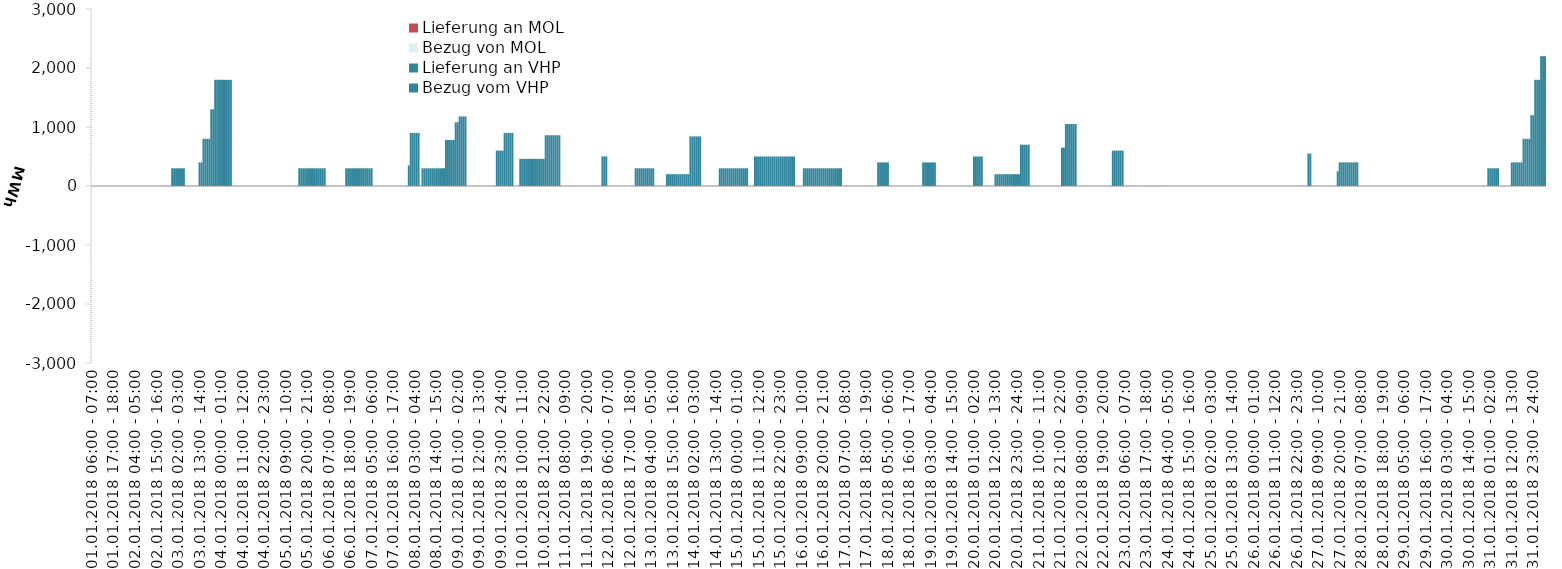
| Category | Bezug vom VHP | Lieferung an VHP | Bezug von MOL | Lieferung an MOL |
|---|---|---|---|---|
| 01.01.2018 06:00 - 07:00 | 0 | 0 | 0 | 0 |
| 01.01.2018 07:00 - 08:00 | 0 | 0 | 0 | 0 |
| 01.01.2018 08:00 - 09:00 | 0 | 0 | 0 | 0 |
| 01.01.2018 09:00 - 10:00 | 0 | 0 | 0 | 0 |
| 01.01.2018 10:00 - 11:00 | 0 | 0 | 0 | 0 |
| 01.01.2018 11:00 - 12:00 | 0 | 0 | 0 | 0 |
| 01.01.2018 12:00 - 13:00 | 0 | 0 | 0 | 0 |
| 01.01.2018 13:00 - 14:00 | 0 | 0 | 0 | 0 |
| 01.01.2018 14:00 - 15:00 | 0 | 0 | 0 | 0 |
| 01.01.2018 15:00 - 16:00 | 0 | 0 | 0 | 0 |
| 01.01.2018 16:00 - 17:00 | 0 | 0 | 0 | 0 |
| 01.01.2018 17:00 - 18:00 | 0 | 0 | 0 | 0 |
| 01.01.2018 18:00 - 19:00 | 0 | 0 | 0 | 0 |
| 01.01.2018 19:00 - 20:00 | 0 | 0 | 0 | 0 |
| 01.01.2018 20:00 - 21:00 | 0 | 0 | 0 | 0 |
| 01.01.2018 21:00 - 22:00 | 0 | 0 | 0 | 0 |
| 01.01.2018 22:00 - 23:00 | 0 | 0 | 0 | 0 |
| 01.01.2018 23:00 - 24:00 | 0 | 0 | 0 | 0 |
| 02.01.2018 00:00 - 01:00 | 0 | 0 | 0 | 0 |
| 02.01.2018 01:00 - 02:00 | 0 | 0 | 0 | 0 |
| 02.01.2018 02:00 - 03:00 | 0 | 0 | 0 | 0 |
| 02.01.2018 03:00 - 04:00 | 0 | 0 | 0 | 0 |
| 02.01.2018 04:00 - 05:00 | 0 | 0 | 0 | 0 |
| 02.01.2018 05:00 - 06:00 | 0 | 0 | 0 | 0 |
| 02.01.2018 06:00 - 07:00 | 0 | 0 | 0 | 0 |
| 02.01.2018 07:00 - 08:00 | 0 | 0 | 0 | 0 |
| 02.01.2018 08:00 - 09:00 | 0 | 0 | 0 | 0 |
| 02.01.2018 09:00 - 10:00 | 0 | 0 | 0 | 0 |
| 02.01.2018 10:00 - 11:00 | 0 | 0 | 0 | 0 |
| 02.01.2018 11:00 - 12:00 | 0 | 0 | 0 | 0 |
| 02.01.2018 12:00 - 13:00 | 0 | 0 | 0 | 0 |
| 02.01.2018 13:00 - 14:00 | 0 | 0 | 0 | 0 |
| 02.01.2018 14:00 - 15:00 | 0 | 0 | 0 | 0 |
| 02.01.2018 15:00 - 16:00 | 0 | 0 | 0 | 0 |
| 02.01.2018 16:00 - 17:00 | 0 | 0 | 0 | 0 |
| 02.01.2018 17:00 - 18:00 | 0 | 0 | 0 | 0 |
| 02.01.2018 18:00 - 19:00 | 0 | 0 | 0 | 0 |
| 02.01.2018 19:00 - 20:00 | 0 | 0 | 0 | 0 |
| 02.01.2018 20:00 - 21:00 | 0 | 0 | 0 | 0 |
| 02.01.2018 21:00 - 22:00 | 0 | 0 | 0 | 0 |
| 02.01.2018 22:00 - 23:00 | 0 | 0 | 0 | 0 |
| 02.01.2018 23:00 - 24:00 | 300 | 0 | 0 | 0 |
| 03.01.2018 00:00 - 01:00 | 300 | 0 | 0 | 0 |
| 03.01.2018 01:00 - 02:00 | 300 | 0 | 0 | 0 |
| 03.01.2018 02:00 - 03:00 | 300 | 0 | 0 | 0 |
| 03.01.2018 03:00 - 04:00 | 300 | 0 | 0 | 0 |
| 03.01.2018 04:00 - 05:00 | 300 | 0 | 0 | 0 |
| 03.01.2018 05:00 - 06:00 | 300 | 0 | 0 | 0 |
| 03.01.2018 06:00 - 07:00 | 0 | 0 | 0 | 0 |
| 03.01.2018 07:00 - 08:00 | 0 | 0 | 0 | 0 |
| 03.01.2018 08:00 - 09:00 | 0 | 0 | 0 | 0 |
| 03.01.2018 09:00 - 10:00 | 0 | 0 | 0 | 0 |
| 03.01.2018 10:00 - 11:00 | 0 | 0 | 0 | 0 |
| 03.01.2018 11:00 - 12:00 | 0 | 0 | 0 | 0 |
| 03.01.2018 12:00 - 13:00 | 0 | 0 | 0 | 0 |
| 03.01.2018 13:00 - 14:00 | 400 | 0 | 0 | 0 |
| 03.01.2018 14:00 - 15:00 | 400 | 0 | 0 | 0 |
| 03.01.2018 15:00 - 16:00 | 800 | 0 | 0 | 0 |
| 03.01.2018 16:00 - 17:00 | 800 | 0 | 0 | 0 |
| 03.01.2018 17:00 - 18:00 | 800 | 0 | 0 | 0 |
| 03.01.2018 18:00 - 19:00 | 800 | 0 | 0 | 0 |
| 03.01.2018 19:00 - 20:00 | 1300 | 0 | 0 | 0 |
| 03.01.2018 20:00 - 21:00 | 1300 | 0 | 0 | 0 |
| 03.01.2018 21:00 - 22:00 | 1800 | 0 | 0 | 0 |
| 03.01.2018 22:00 - 23:00 | 1800 | 0 | 0 | 0 |
| 03.01.2018 23:00 - 24:00 | 1800 | 0 | 0 | 0 |
| 04.01.2018 00:00 - 01:00 | 1800 | 0 | 0 | 0 |
| 04.01.2018 01:00 - 02:00 | 1800 | 0 | 0 | 0 |
| 04.01.2018 02:00 - 03:00 | 1800 | 0 | 0 | 0 |
| 04.01.2018 03:00 - 04:00 | 1800 | 0 | 0 | 0 |
| 04.01.2018 04:00 - 05:00 | 1800 | 0 | 0 | 0 |
| 04.01.2018 05:00 - 06:00 | 1800 | 0 | 0 | 0 |
| 04.01.2018 06:00 - 07:00 | 0 | 0 | 0 | 0 |
| 04.01.2018 07:00 - 08:00 | 0 | 0 | 0 | 0 |
| 04.01.2018 08:00 - 09:00 | 0 | 0 | 0 | 0 |
| 04.01.2018 09:00 - 10:00 | 0 | 0 | 0 | 0 |
| 04.01.2018 10:00 - 11:00 | 0 | 0 | 0 | 0 |
| 04.01.2018 11:00 - 12:00 | 0 | 0 | 0 | 0 |
| 04.01.2018 12:00 - 13:00 | 0 | 0 | 0 | 0 |
| 04.01.2018 13:00 - 14:00 | 0 | 0 | 0 | 0 |
| 04.01.2018 14:00 - 15:00 | 0 | 0 | 0 | 0 |
| 04.01.2018 15:00 - 16:00 | 0 | 0 | 0 | 0 |
| 04.01.2018 16:00 - 17:00 | 0 | 0 | 0 | 0 |
| 04.01.2018 17:00 - 18:00 | 0 | 0 | 0 | 0 |
| 04.01.2018 18:00 - 19:00 | 0 | 0 | 0 | 0 |
| 04.01.2018 19:00 - 20:00 | 0 | 0 | 0 | 0 |
| 04.01.2018 20:00 - 21:00 | 0 | 0 | 0 | 0 |
| 04.01.2018 21:00 - 22:00 | 0 | 0 | 0 | 0 |
| 04.01.2018 22:00 - 23:00 | 0 | 0 | 0 | 0 |
| 04.01.2018 23:00 - 24:00 | 0 | 0 | 0 | 0 |
| 05.01.2018 00:00 - 01:00 | 0 | 0 | 0 | 0 |
| 05.01.2018 01:00 - 02:00 | 0 | 0 | 0 | 0 |
| 05.01.2018 02:00 - 03:00 | 0 | 0 | 0 | 0 |
| 05.01.2018 03:00 - 04:00 | 0 | 0 | 0 | 0 |
| 05.01.2018 04:00 - 05:00 | 0 | 0 | 0 | 0 |
| 05.01.2018 05:00 - 06:00 | 0 | 0 | 0 | 0 |
| 05.01.2018 06:00 - 07:00 | 0 | 0 | 0 | 0 |
| 05.01.2018 07:00 - 08:00 | 0 | 0 | 0 | 0 |
| 05.01.2018 08:00 - 09:00 | 0 | 0 | 0 | 0 |
| 05.01.2018 09:00 - 10:00 | 0 | 0 | 0 | 0 |
| 05.01.2018 10:00 - 11:00 | 0 | 0 | 0 | 0 |
| 05.01.2018 11:00 - 12:00 | 0 | 0 | 0 | 0 |
| 05.01.2018 12:00 - 13:00 | 0 | 0 | 0 | 0 |
| 05.01.2018 13:00 - 14:00 | 0 | 0 | 0 | 0 |
| 05.01.2018 14:00 - 15:00 | 0 | 0 | 0 | 0 |
| 05.01.2018 15:00 - 16:00 | 0 | 0 | 0 | 0 |
| 05.01.2018 16:00 - 17:00 | 300 | 0 | 0 | 0 |
| 05.01.2018 17:00 - 18:00 | 300 | 0 | 0 | 0 |
| 05.01.2018 18:00 - 19:00 | 300 | 0 | 0 | 0 |
| 05.01.2018 19:00 - 20:00 | 300 | 0 | 0 | 0 |
| 05.01.2018 20:00 - 21:00 | 300 | 0 | 0 | 0 |
| 05.01.2018 21:00 - 22:00 | 300 | 0 | 0 | 0 |
| 05.01.2018 22:00 - 23:00 | 300 | 0 | 0 | 0 |
| 05.01.2018 23:00 - 24:00 | 300 | 0 | 0 | 0 |
| 06.01.2018 00:00 - 01:00 | 300 | 0 | 0 | 0 |
| 06.01.2018 01:00 - 02:00 | 300 | 0 | 0 | 0 |
| 06.01.2018 02:00 - 03:00 | 300 | 0 | 0 | 0 |
| 06.01.2018 03:00 - 04:00 | 300 | 0 | 0 | 0 |
| 06.01.2018 04:00 - 05:00 | 300 | 0 | 0 | 0 |
| 06.01.2018 05:00 - 06:00 | 300 | 0 | 0 | 0 |
| 06.01.2018 06:00 - 07:00 | 0 | 0 | 0 | 0 |
| 06.01.2018 07:00 - 08:00 | 0 | 0 | 0 | 0 |
| 06.01.2018 08:00 - 09:00 | 0 | 0 | 0 | 0 |
| 06.01.2018 09:00 - 10:00 | 0 | 0 | 0 | 0 |
| 06.01.2018 10:00 - 11:00 | 0 | 0 | 0 | 0 |
| 06.01.2018 11:00 - 12:00 | 0 | 0 | 0 | 0 |
| 06.01.2018 12:00 - 13:00 | 0 | 0 | 0 | 0 |
| 06.01.2018 13:00 - 14:00 | 0 | 0 | 0 | 0 |
| 06.01.2018 14:00 - 15:00 | 0 | 0 | 0 | 0 |
| 06.01.2018 15:00 - 16:00 | 0 | 0 | 0 | 0 |
| 06.01.2018 16:00 - 17:00 | 300 | 0 | 0 | 0 |
| 06.01.2018 17:00 - 18:00 | 300 | 0 | 0 | 0 |
| 06.01.2018 18:00 - 19:00 | 300 | 0 | 0 | 0 |
| 06.01.2018 19:00 - 20:00 | 300 | 0 | 0 | 0 |
| 06.01.2018 20:00 - 21:00 | 300 | 0 | 0 | 0 |
| 06.01.2018 21:00 - 22:00 | 300 | 0 | 0 | 0 |
| 06.01.2018 22:00 - 23:00 | 300 | 0 | 0 | 0 |
| 06.01.2018 23:00 - 24:00 | 300 | 0 | 0 | 0 |
| 07.01.2018 00:00 - 01:00 | 300 | 0 | 0 | 0 |
| 07.01.2018 01:00 - 02:00 | 300 | 0 | 0 | 0 |
| 07.01.2018 02:00 - 03:00 | 300 | 0 | 0 | 0 |
| 07.01.2018 03:00 - 04:00 | 300 | 0 | 0 | 0 |
| 07.01.2018 04:00 - 05:00 | 300 | 0 | 0 | 0 |
| 07.01.2018 05:00 - 06:00 | 300 | 0 | 0 | 0 |
| 07.01.2018 06:00 - 07:00 | 0 | 0 | 0 | 0 |
| 07.01.2018 07:00 - 08:00 | 0 | 0 | 0 | 0 |
| 07.01.2018 08:00 - 09:00 | 0 | 0 | 0 | 0 |
| 07.01.2018 09:00 - 10:00 | 0 | 0 | 0 | 0 |
| 07.01.2018 10:00 - 11:00 | 0 | 0 | 0 | 0 |
| 07.01.2018 11:00 - 12:00 | 0 | 0 | 0 | 0 |
| 07.01.2018 12:00 - 13:00 | 0 | 0 | 0 | 0 |
| 07.01.2018 13:00 - 14:00 | 0 | 0 | 0 | 0 |
| 07.01.2018 14:00 - 15:00 | 0 | 0 | 0 | 0 |
| 07.01.2018 15:00 - 16:00 | 0 | 0 | 0 | 0 |
| 07.01.2018 16:00 - 17:00 | 0 | 0 | 0 | 0 |
| 07.01.2018 17:00 - 18:00 | 0 | 0 | 0 | 0 |
| 07.01.2018 18:00 - 19:00 | 0 | 0 | 0 | 0 |
| 07.01.2018 19:00 - 20:00 | 0 | 0 | 0 | 0 |
| 07.01.2018 20:00 - 21:00 | 0 | 0 | 0 | 0 |
| 07.01.2018 21:00 - 22:00 | 0 | 0 | 0 | 0 |
| 07.01.2018 22:00 - 23:00 | 0 | 0 | 0 | 0 |
| 07.01.2018 23:00 - 24:00 | 0 | 0 | 0 | 0 |
| 08.01.2018 00:00 - 01:00 | 349 | 0 | 0 | 0 |
| 08.01.2018 01:00 - 02:00 | 900 | 0 | 0 | 0 |
| 08.01.2018 02:00 - 03:00 | 900 | 0 | 0 | 0 |
| 08.01.2018 03:00 - 04:00 | 900 | 0 | 0 | 0 |
| 08.01.2018 04:00 - 05:00 | 900 | 0 | 0 | 0 |
| 08.01.2018 05:00 - 06:00 | 900 | 0 | 0 | 0 |
| 08.01.2018 06:00 - 07:00 | 0 | 0 | 0 | 0 |
| 08.01.2018 07:00 - 08:00 | 300 | 0 | 0 | 0 |
| 08.01.2018 08:00 - 09:00 | 300 | 0 | 0 | 0 |
| 08.01.2018 09:00 - 10:00 | 300 | 0 | 0 | 0 |
| 08.01.2018 10:00 - 11:00 | 300 | 0 | 0 | 0 |
| 08.01.2018 11:00 - 12:00 | 300 | 0 | 0 | 0 |
| 08.01.2018 12:00 - 13:00 | 300 | 0 | 0 | 0 |
| 08.01.2018 13:00 - 14:00 | 300 | 0 | 0 | 0 |
| 08.01.2018 14:00 - 15:00 | 300 | 0 | 0 | 0 |
| 08.01.2018 15:00 - 16:00 | 300 | 0 | 0 | 0 |
| 08.01.2018 16:00 - 17:00 | 300 | 0 | 0 | 0 |
| 08.01.2018 17:00 - 18:00 | 300 | 0 | 0 | 0 |
| 08.01.2018 18:00 - 19:00 | 300 | 0 | 0 | 0 |
| 08.01.2018 19:00 - 20:00 | 780 | 0 | 0 | 0 |
| 08.01.2018 20:00 - 21:00 | 780 | 0 | 0 | 0 |
| 08.01.2018 21:00 - 22:00 | 780 | 0 | 0 | 0 |
| 08.01.2018 22:00 - 23:00 | 780 | 0 | 0 | 0 |
| 08.01.2018 23:00 - 24:00 | 780 | 0 | 0 | 0 |
| 09.01.2018 00:00 - 01:00 | 1080 | 0 | 0 | 0 |
| 09.01.2018 01:00 - 02:00 | 1080 | 0 | 0 | 0 |
| 09.01.2018 02:00 - 03:00 | 1180 | 0 | 0 | 0 |
| 09.01.2018 03:00 - 04:00 | 1180 | 0 | 0 | 0 |
| 09.01.2018 04:00 - 05:00 | 1180 | 0 | 0 | 0 |
| 09.01.2018 05:00 - 06:00 | 1180 | 0 | 0 | 0 |
| 09.01.2018 06:00 - 07:00 | 0 | 0 | 0 | 0 |
| 09.01.2018 07:00 - 08:00 | 0 | 0 | 0 | 0 |
| 09.01.2018 08:00 - 09:00 | 0 | 0 | 0 | 0 |
| 09.01.2018 09:00 - 10:00 | 0 | 0 | 0 | 0 |
| 09.01.2018 10:00 - 11:00 | 0 | 0 | 0 | 0 |
| 09.01.2018 11:00 - 12:00 | 0 | 0 | 0 | 0 |
| 09.01.2018 12:00 - 13:00 | 0 | 0 | 0 | 0 |
| 09.01.2018 13:00 - 14:00 | 0 | 0 | 0 | 0 |
| 09.01.2018 14:00 - 15:00 | 0 | 0 | 0 | 0 |
| 09.01.2018 15:00 - 16:00 | 0 | 0 | 0 | 0 |
| 09.01.2018 16:00 - 17:00 | 0 | 0 | 0 | 0 |
| 09.01.2018 17:00 - 18:00 | 0 | 0 | 0 | 0 |
| 09.01.2018 18:00 - 19:00 | 0 | 0 | 0 | 0 |
| 09.01.2018 19:00 - 20:00 | 0 | 0 | 0 | 0 |
| 09.01.2018 20:00 - 21:00 | 0 | 0 | 0 | 0 |
| 09.01.2018 21:00 - 22:00 | 600 | 0 | 0 | 0 |
| 09.01.2018 22:00 - 23:00 | 600 | 0 | 0 | 0 |
| 09.01.2018 23:00 - 24:00 | 600 | 0 | 0 | 0 |
| 10.01.2018 00:00 - 01:00 | 600 | 0 | 0 | 0 |
| 10.01.2018 01:00 - 02:00 | 900 | 0 | 0 | 0 |
| 10.01.2018 02:00 - 03:00 | 900 | 0 | 0 | 0 |
| 10.01.2018 03:00 - 04:00 | 900 | 0 | 0 | 0 |
| 10.01.2018 04:00 - 05:00 | 900 | 0 | 0 | 0 |
| 10.01.2018 05:00 - 06:00 | 900 | 0 | 0 | 0 |
| 10.01.2018 06:00 - 07:00 | 0 | 0 | 0 | 0 |
| 10.01.2018 07:00 - 08:00 | 0 | 0 | 0 | 0 |
| 10.01.2018 08:00 - 09:00 | 0 | 0 | 0 | 0 |
| 10.01.2018 09:00 - 10:00 | 460 | 0 | 0 | 0 |
| 10.01.2018 10:00 - 11:00 | 460 | 0 | 0 | 0 |
| 10.01.2018 11:00 - 12:00 | 460 | 0 | 0 | 0 |
| 10.01.2018 12:00 - 13:00 | 460 | 0 | 0 | 0 |
| 10.01.2018 13:00 - 14:00 | 460 | 0 | 0 | 0 |
| 10.01.2018 14:00 - 15:00 | 460 | 0 | 0 | 0 |
| 10.01.2018 15:00 - 16:00 | 460 | 0 | 0 | 0 |
| 10.01.2018 16:00 - 17:00 | 460 | 0 | 0 | 0 |
| 10.01.2018 17:00 - 18:00 | 460 | 0 | 0 | 0 |
| 10.01.2018 18:00 - 19:00 | 460 | 0 | 0 | 0 |
| 10.01.2018 19:00 - 20:00 | 460 | 0 | 0 | 0 |
| 10.01.2018 20:00 - 21:00 | 460 | 0 | 0 | 0 |
| 10.01.2018 21:00 - 22:00 | 460 | 0 | 0 | 0 |
| 10.01.2018 22:00 - 23:00 | 860 | 0 | 0 | 0 |
| 10.01.2018 23:00 - 24:00 | 860 | 0 | 0 | 0 |
| 11.01.2018 00:00 - 01:00 | 860 | 0 | 0 | 0 |
| 11.01.2018 01:00 - 02:00 | 860 | 0 | 0 | 0 |
| 11.01.2018 02:00 - 03:00 | 860 | 0 | 0 | 0 |
| 11.01.2018 03:00 - 04:00 | 860 | 0 | 0 | 0 |
| 11.01.2018 04:00 - 05:00 | 860 | 0 | 0 | 0 |
| 11.01.2018 05:00 - 06:00 | 860 | 0 | 0 | 0 |
| 11.01.2018 06:00 - 07:00 | 0 | 0 | 0 | 0 |
| 11.01.2018 07:00 - 08:00 | 0 | 0 | 0 | 0 |
| 11.01.2018 08:00 - 09:00 | 0 | 0 | 0 | 0 |
| 11.01.2018 09:00 - 10:00 | 0 | 0 | 0 | 0 |
| 11.01.2018 10:00 - 11:00 | 0 | 0 | 0 | 0 |
| 11.01.2018 11:00 - 12:00 | 0 | 0 | 0 | 0 |
| 11.01.2018 12:00 - 13:00 | 0 | 0 | 0 | 0 |
| 11.01.2018 13:00 - 14:00 | 0 | 0 | 0 | 0 |
| 11.01.2018 14:00 - 15:00 | 0 | 0 | 0 | 0 |
| 11.01.2018 15:00 - 16:00 | 0 | 0 | 0 | 0 |
| 11.01.2018 16:00 - 17:00 | 0 | 0 | 0 | 0 |
| 11.01.2018 17:00 - 18:00 | 0 | 0 | 0 | 0 |
| 11.01.2018 18:00 - 19:00 | 0 | 0 | 0 | 0 |
| 11.01.2018 19:00 - 20:00 | 0 | 0 | 0 | 0 |
| 11.01.2018 20:00 - 21:00 | 0 | 0 | 0 | 0 |
| 11.01.2018 21:00 - 22:00 | 0 | 0 | 0 | 0 |
| 11.01.2018 22:00 - 23:00 | 0 | 0 | 0 | 0 |
| 11.01.2018 23:00 - 24:00 | 0 | 0 | 0 | 0 |
| 12.01.2018 00:00 - 01:00 | 0 | 0 | 0 | 0 |
| 12.01.2018 01:00 - 02:00 | 0 | 0 | 0 | 0 |
| 12.01.2018 02:00 - 03:00 | 0 | 0 | 0 | 0 |
| 12.01.2018 03:00 - 04:00 | 501 | 0 | 0 | 0 |
| 12.01.2018 04:00 - 05:00 | 501 | 0 | 0 | 0 |
| 12.01.2018 05:00 - 06:00 | 501 | 0 | 0 | 0 |
| 12.01.2018 06:00 - 07:00 | 0 | 0 | 0 | 0 |
| 12.01.2018 07:00 - 08:00 | 0 | 0 | 0 | 0 |
| 12.01.2018 08:00 - 09:00 | 0 | 0 | 0 | 0 |
| 12.01.2018 09:00 - 10:00 | 0 | 0 | 0 | 0 |
| 12.01.2018 10:00 - 11:00 | 0 | 0 | 0 | 0 |
| 12.01.2018 11:00 - 12:00 | 0 | 0 | 0 | 0 |
| 12.01.2018 12:00 - 13:00 | 0 | 0 | 0 | 0 |
| 12.01.2018 13:00 - 14:00 | 0 | 0 | 0 | 0 |
| 12.01.2018 14:00 - 15:00 | 0 | 0 | 0 | 0 |
| 12.01.2018 15:00 - 16:00 | 0 | 0 | 0 | 0 |
| 12.01.2018 16:00 - 17:00 | 0 | 0 | 0 | 0 |
| 12.01.2018 17:00 - 18:00 | 0 | 0 | 0 | 0 |
| 12.01.2018 18:00 - 19:00 | 0 | 0 | 0 | 0 |
| 12.01.2018 19:00 - 20:00 | 0 | 0 | 0 | 0 |
| 12.01.2018 20:00 - 21:00 | 300 | 0 | 0 | 0 |
| 12.01.2018 21:00 - 22:00 | 300 | 0 | 0 | 0 |
| 12.01.2018 22:00 - 23:00 | 300 | 0 | 0 | 0 |
| 12.01.2018 23:00 - 24:00 | 300 | 0 | 0 | 0 |
| 13.01.2018 00:00 - 01:00 | 300 | 0 | 0 | 0 |
| 13.01.2018 01:00 - 02:00 | 300 | 0 | 0 | 0 |
| 13.01.2018 02:00 - 03:00 | 300 | 0 | 0 | 0 |
| 13.01.2018 03:00 - 04:00 | 300 | 0 | 0 | 0 |
| 13.01.2018 04:00 - 05:00 | 300 | 0 | 0 | 0 |
| 13.01.2018 05:00 - 06:00 | 300 | 0 | 0 | 0 |
| 13.01.2018 06:00 - 07:00 | 0 | 0 | 0 | 0 |
| 13.01.2018 07:00 - 08:00 | 0 | 0 | 0 | 0 |
| 13.01.2018 08:00 - 09:00 | 0 | 0 | 0 | 0 |
| 13.01.2018 09:00 - 10:00 | 0 | 0 | 0 | 0 |
| 13.01.2018 10:00 - 11:00 | 0 | 0 | 0 | 0 |
| 13.01.2018 11:00 - 12:00 | 0 | 0 | 0 | 0 |
| 13.01.2018 12:00 - 13:00 | 200 | 0 | 0 | 0 |
| 13.01.2018 13:00 - 14:00 | 200 | 0 | 0 | 0 |
| 13.01.2018 14:00 - 15:00 | 200 | 0 | 0 | 0 |
| 13.01.2018 15:00 - 16:00 | 200 | 0 | 0 | 0 |
| 13.01.2018 16:00 - 17:00 | 200 | 0 | 0 | 0 |
| 13.01.2018 17:00 - 18:00 | 200 | 0 | 0 | 0 |
| 13.01.2018 18:00 - 19:00 | 200 | 0 | 0 | 0 |
| 13.01.2018 19:00 - 20:00 | 200 | 0 | 0 | 0 |
| 13.01.2018 20:00 - 21:00 | 200 | 0 | 0 | 0 |
| 13.01.2018 21:00 - 22:00 | 200 | 0 | 0 | 0 |
| 13.01.2018 22:00 - 23:00 | 200 | 0 | 0 | 0 |
| 13.01.2018 23:00 - 24:00 | 200 | 0 | 0 | 0 |
| 14.01.2018 00:00 - 01:00 | 840 | 0 | 0 | 0 |
| 14.01.2018 01:00 - 02:00 | 840 | 0 | 0 | 0 |
| 14.01.2018 02:00 - 03:00 | 840 | 0 | 0 | 0 |
| 14.01.2018 03:00 - 04:00 | 840 | 0 | 0 | 0 |
| 14.01.2018 04:00 - 05:00 | 840 | 0 | 0 | 0 |
| 14.01.2018 05:00 - 06:00 | 840 | 0 | 0 | 0 |
| 14.01.2018 06:00 - 07:00 | 0 | 0 | 0 | 0 |
| 14.01.2018 07:00 - 08:00 | 0 | 0 | 0 | 0 |
| 14.01.2018 08:00 - 09:00 | 0 | 0 | 0 | 0 |
| 14.01.2018 09:00 - 10:00 | 0 | 0 | 0 | 0 |
| 14.01.2018 10:00 - 11:00 | 0 | 0 | 0 | 0 |
| 14.01.2018 11:00 - 12:00 | 0 | 0 | 0 | 0 |
| 14.01.2018 12:00 - 13:00 | 0 | 0 | 0 | 0 |
| 14.01.2018 13:00 - 14:00 | 0 | 0 | 0 | 0 |
| 14.01.2018 14:00 - 15:00 | 0 | 0 | 0 | 0 |
| 14.01.2018 15:00 - 16:00 | 300 | 0 | 0 | 0 |
| 14.01.2018 16:00 - 17:00 | 300 | 0 | 0 | 0 |
| 14.01.2018 17:00 - 18:00 | 300 | 0 | 0 | 0 |
| 14.01.2018 18:00 - 19:00 | 300 | 0 | 0 | 0 |
| 14.01.2018 19:00 - 20:00 | 300 | 0 | 0 | 0 |
| 14.01.2018 20:00 - 21:00 | 300 | 0 | 0 | 0 |
| 14.01.2018 21:00 - 22:00 | 300 | 0 | 0 | 0 |
| 14.01.2018 22:00 - 23:00 | 300 | 0 | 0 | 0 |
| 14.01.2018 23:00 - 24:00 | 300 | 0 | 0 | 0 |
| 15.01.2018 00:00 - 01:00 | 300 | 0 | 0 | 0 |
| 15.01.2018 01:00 - 02:00 | 300 | 0 | 0 | 0 |
| 15.01.2018 02:00 - 03:00 | 300 | 0 | 0 | 0 |
| 15.01.2018 03:00 - 04:00 | 300 | 0 | 0 | 0 |
| 15.01.2018 04:00 - 05:00 | 300 | 0 | 0 | 0 |
| 15.01.2018 05:00 - 06:00 | 300 | 0 | 0 | 0 |
| 15.01.2018 06:00 - 07:00 | 0 | 0 | 0 | 0 |
| 15.01.2018 07:00 - 08:00 | 0 | 0 | 0 | 0 |
| 15.01.2018 08:00 - 09:00 | 0 | 0 | 0 | 0 |
| 15.01.2018 09:00 - 10:00 | 500 | 0 | 0 | 0 |
| 15.01.2018 10:00 - 11:00 | 500 | 0 | 0 | 0 |
| 15.01.2018 11:00 - 12:00 | 500 | 0 | 0 | 0 |
| 15.01.2018 12:00 - 13:00 | 500 | 0 | 0 | 0 |
| 15.01.2018 13:00 - 14:00 | 500 | 0 | 0 | 0 |
| 15.01.2018 14:00 - 15:00 | 500 | 0 | 0 | 0 |
| 15.01.2018 15:00 - 16:00 | 500 | 0 | 0 | 0 |
| 15.01.2018 16:00 - 17:00 | 500 | 0 | 0 | 0 |
| 15.01.2018 17:00 - 18:00 | 500 | 0 | 0 | 0 |
| 15.01.2018 18:00 - 19:00 | 500 | 0 | 0 | 0 |
| 15.01.2018 19:00 - 20:00 | 500 | 0 | 0 | 0 |
| 15.01.2018 20:00 - 21:00 | 500 | 0 | 0 | 0 |
| 15.01.2018 21:00 - 22:00 | 500 | 0 | 0 | 0 |
| 15.01.2018 22:00 - 23:00 | 500 | 0 | 0 | 0 |
| 15.01.2018 23:00 - 24:00 | 500 | 0 | 0 | 0 |
| 16.01.2018 00:00 - 01:00 | 500 | 0 | 0 | 0 |
| 16.01.2018 01:00 - 02:00 | 500 | 0 | 0 | 0 |
| 16.01.2018 02:00 - 03:00 | 500 | 0 | 0 | 0 |
| 16.01.2018 03:00 - 04:00 | 500 | 0 | 0 | 0 |
| 16.01.2018 04:00 - 05:00 | 500 | 0 | 0 | 0 |
| 16.01.2018 05:00 - 06:00 | 500 | 0 | 0 | 0 |
| 16.01.2018 06:00 - 07:00 | 0 | 0 | 0 | 0 |
| 16.01.2018 07:00 - 08:00 | 0 | 0 | 0 | 0 |
| 16.01.2018 08:00 - 09:00 | 0 | 0 | 0 | 0 |
| 16.01.2018 09:00 - 10:00 | 0 | 0 | 0 | 0 |
| 16.01.2018 10:00 - 11:00 | 300 | 0 | 0 | 0 |
| 16.01.2018 11:00 - 12:00 | 300 | 0 | 0 | 0 |
| 16.01.2018 12:00 - 13:00 | 300 | 0 | 0 | 0 |
| 16.01.2018 13:00 - 14:00 | 300 | 0 | 0 | 0 |
| 16.01.2018 14:00 - 15:00 | 300 | 0 | 0 | 0 |
| 16.01.2018 15:00 - 16:00 | 300 | 0 | 0 | 0 |
| 16.01.2018 16:00 - 17:00 | 300 | 0 | 0 | 0 |
| 16.01.2018 17:00 - 18:00 | 300 | 0 | 0 | 0 |
| 16.01.2018 18:00 - 19:00 | 300 | 0 | 0 | 0 |
| 16.01.2018 19:00 - 20:00 | 300 | 0 | 0 | 0 |
| 16.01.2018 20:00 - 21:00 | 300 | 0 | 0 | 0 |
| 16.01.2018 21:00 - 22:00 | 300 | 0 | 0 | 0 |
| 16.01.2018 22:00 - 23:00 | 300 | 0 | 0 | 0 |
| 16.01.2018 23:00 - 24:00 | 300 | 0 | 0 | 0 |
| 17.01.2018 00:00 - 01:00 | 300 | 0 | 0 | 0 |
| 17.01.2018 01:00 - 02:00 | 300 | 0 | 0 | 0 |
| 17.01.2018 02:00 - 03:00 | 300 | 0 | 0 | 0 |
| 17.01.2018 03:00 - 04:00 | 300 | 0 | 0 | 0 |
| 17.01.2018 04:00 - 05:00 | 300 | 0 | 0 | 0 |
| 17.01.2018 05:00 - 06:00 | 300 | 0 | 0 | 0 |
| 17.01.2018 06:00 - 07:00 | 0 | 0 | 0 | 0 |
| 17.01.2018 07:00 - 08:00 | 0 | 0 | 0 | 0 |
| 17.01.2018 08:00 - 09:00 | 0 | 0 | 0 | 0 |
| 17.01.2018 09:00 - 10:00 | 0 | 0 | 0 | 0 |
| 17.01.2018 10:00 - 11:00 | 0 | 0 | 0 | 0 |
| 17.01.2018 11:00 - 12:00 | 0 | 0 | 0 | 0 |
| 17.01.2018 12:00 - 13:00 | 0 | 0 | 0 | 0 |
| 17.01.2018 13:00 - 14:00 | 0 | 0 | 0 | 0 |
| 17.01.2018 14:00 - 15:00 | 0 | 0 | 0 | 0 |
| 17.01.2018 15:00 - 16:00 | 0 | 0 | 0 | 0 |
| 17.01.2018 16:00 - 17:00 | 0 | 0 | 0 | 0 |
| 17.01.2018 17:00 - 18:00 | 0 | 0 | 0 | 0 |
| 17.01.2018 18:00 - 19:00 | 0 | 0 | 0 | 0 |
| 17.01.2018 19:00 - 20:00 | 0 | 0 | 0 | 0 |
| 17.01.2018 20:00 - 21:00 | 0 | 0 | 0 | 0 |
| 17.01.2018 21:00 - 22:00 | 0 | 0 | 0 | 0 |
| 17.01.2018 22:00 - 23:00 | 0 | 0 | 0 | 0 |
| 17.01.2018 23:00 - 24:00 | 0 | 0 | 0 | 0 |
| 18.01.2018 00:00 - 01:00 | 400 | 0 | 0 | 0 |
| 18.01.2018 01:00 - 02:00 | 400 | 0 | 0 | 0 |
| 18.01.2018 02:00 - 03:00 | 400 | 0 | 0 | 0 |
| 18.01.2018 03:00 - 04:00 | 400 | 0 | 0 | 0 |
| 18.01.2018 04:00 - 05:00 | 400 | 0 | 0 | 0 |
| 18.01.2018 05:00 - 06:00 | 400 | 0 | 0 | 0 |
| 18.01.2018 06:00 - 07:00 | 0 | 0 | 0 | 0 |
| 18.01.2018 07:00 - 08:00 | 0 | 0 | 0 | 0 |
| 18.01.2018 08:00 - 09:00 | 0 | 0 | 0 | 0 |
| 18.01.2018 09:00 - 10:00 | 0 | 0 | 0 | 0 |
| 18.01.2018 10:00 - 11:00 | 0 | 0 | 0 | 0 |
| 18.01.2018 11:00 - 12:00 | 0 | 0 | 0 | 0 |
| 18.01.2018 12:00 - 13:00 | 0 | 0 | 0 | 0 |
| 18.01.2018 13:00 - 14:00 | 0 | 0 | 0 | 0 |
| 18.01.2018 14:00 - 15:00 | 0 | 0 | 0 | 0 |
| 18.01.2018 15:00 - 16:00 | 0 | 0 | 0 | 0 |
| 18.01.2018 16:00 - 17:00 | 0 | 0 | 0 | 0 |
| 18.01.2018 17:00 - 18:00 | 0 | 0 | 0 | 0 |
| 18.01.2018 18:00 - 19:00 | 0 | 0 | 0 | 0 |
| 18.01.2018 19:00 - 20:00 | 0 | 0 | 0 | 0 |
| 18.01.2018 20:00 - 21:00 | 0 | 0 | 0 | 0 |
| 18.01.2018 21:00 - 22:00 | 0 | 0 | 0 | 0 |
| 18.01.2018 22:00 - 23:00 | 0 | 0 | 0 | 0 |
| 18.01.2018 23:00 - 24:00 | 400 | 0 | 0 | 0 |
| 19.01.2018 00:00 - 01:00 | 400 | 0 | 0 | 0 |
| 19.01.2018 01:00 - 02:00 | 400 | 0 | 0 | 0 |
| 19.01.2018 02:00 - 03:00 | 400 | 0 | 0 | 0 |
| 19.01.2018 03:00 - 04:00 | 400 | 0 | 0 | 0 |
| 19.01.2018 04:00 - 05:00 | 400 | 0 | 0 | 0 |
| 19.01.2018 05:00 - 06:00 | 400 | 0 | 0 | 0 |
| 19.01.2018 06:00 - 07:00 | 0 | 0 | 0 | 0 |
| 19.01.2018 07:00 - 08:00 | 0 | 0 | 0 | 0 |
| 19.01.2018 08:00 - 09:00 | 0 | 0 | 0 | 0 |
| 19.01.2018 09:00 - 10:00 | 0 | 0 | 0 | 0 |
| 19.01.2018 10:00 - 11:00 | 0 | 0 | 0 | 0 |
| 19.01.2018 11:00 - 12:00 | 0 | 0 | 0 | 0 |
| 19.01.2018 12:00 - 13:00 | 0 | 0 | 0 | 0 |
| 19.01.2018 13:00 - 14:00 | 0 | 0 | 0 | 0 |
| 19.01.2018 14:00 - 15:00 | 0 | 0 | 0 | 0 |
| 19.01.2018 15:00 - 16:00 | 0 | 0 | 0 | 0 |
| 19.01.2018 16:00 - 17:00 | 0 | 0 | 0 | 0 |
| 19.01.2018 17:00 - 18:00 | 0 | 0 | 0 | 0 |
| 19.01.2018 18:00 - 19:00 | 0 | 0 | 0 | 0 |
| 19.01.2018 19:00 - 20:00 | 0 | 0 | 0 | 0 |
| 19.01.2018 20:00 - 21:00 | 0 | 0 | 0 | 0 |
| 19.01.2018 21:00 - 22:00 | 0 | 0 | 0 | 0 |
| 19.01.2018 22:00 - 23:00 | 0 | 0 | 0 | 0 |
| 19.01.2018 23:00 - 24:00 | 0 | 0 | 0 | 0 |
| 20.01.2018 00:00 - 01:00 | 0 | 0 | 0 | 0 |
| 20.01.2018 01:00 - 02:00 | 500 | 0 | 0 | 0 |
| 20.01.2018 02:00 - 03:00 | 500 | 0 | 0 | 0 |
| 20.01.2018 03:00 - 04:00 | 500 | 0 | 0 | 0 |
| 20.01.2018 04:00 - 05:00 | 500 | 0 | 0 | 0 |
| 20.01.2018 05:00 - 06:00 | 500 | 0 | 0 | 0 |
| 20.01.2018 06:00 - 07:00 | 0 | 0 | 0 | 0 |
| 20.01.2018 07:00 - 08:00 | 0 | 0 | 0 | 0 |
| 20.01.2018 08:00 - 09:00 | 0 | 0 | 0 | 0 |
| 20.01.2018 09:00 - 10:00 | 0 | 0 | 0 | 0 |
| 20.01.2018 10:00 - 11:00 | 0 | 0 | 0 | 0 |
| 20.01.2018 11:00 - 12:00 | 0 | 0 | 0 | 0 |
| 20.01.2018 12:00 - 13:00 | 200 | 0 | 0 | 0 |
| 20.01.2018 13:00 - 14:00 | 200 | 0 | 0 | 0 |
| 20.01.2018 14:00 - 15:00 | 200 | 0 | 0 | 0 |
| 20.01.2018 15:00 - 16:00 | 200 | 0 | 0 | 0 |
| 20.01.2018 16:00 - 17:00 | 200 | 0 | 0 | 0 |
| 20.01.2018 17:00 - 18:00 | 200 | 0 | 0 | 0 |
| 20.01.2018 18:00 - 19:00 | 200 | 0 | 0 | 0 |
| 20.01.2018 19:00 - 20:00 | 200 | 0 | 0 | 0 |
| 20.01.2018 20:00 - 21:00 | 200 | 0 | 0 | 0 |
| 20.01.2018 21:00 - 22:00 | 200 | 0 | 0 | 0 |
| 20.01.2018 22:00 - 23:00 | 200 | 0 | 0 | 0 |
| 20.01.2018 23:00 - 24:00 | 200 | 0 | 0 | 0 |
| 21.01.2018 00:00 - 01:00 | 200 | 0 | 0 | 0 |
| 21.01.2018 01:00 - 02:00 | 700 | 0 | 0 | 0 |
| 21.01.2018 02:00 - 03:00 | 700 | 0 | 0 | 0 |
| 21.01.2018 03:00 - 04:00 | 700 | 0 | 0 | 0 |
| 21.01.2018 04:00 - 05:00 | 700 | 0 | 0 | 0 |
| 21.01.2018 05:00 - 06:00 | 700 | 0 | 0 | 0 |
| 21.01.2018 06:00 - 07:00 | 0 | 0 | 0 | 0 |
| 21.01.2018 07:00 - 08:00 | 0 | 0 | 0 | 0 |
| 21.01.2018 08:00 - 09:00 | 0 | 0 | 0 | 0 |
| 21.01.2018 09:00 - 10:00 | 0 | 0 | 0 | 0 |
| 21.01.2018 10:00 - 11:00 | 0 | 0 | 0 | 0 |
| 21.01.2018 11:00 - 12:00 | 0 | 0 | 0 | 0 |
| 21.01.2018 12:00 - 13:00 | 0 | 0 | 0 | 0 |
| 21.01.2018 13:00 - 14:00 | 0 | 0 | 0 | 0 |
| 21.01.2018 14:00 - 15:00 | 0 | 0 | 0 | 0 |
| 21.01.2018 15:00 - 16:00 | 0 | 0 | 0 | 0 |
| 21.01.2018 16:00 - 17:00 | 0 | 0 | 0 | 0 |
| 21.01.2018 17:00 - 18:00 | 0 | 0 | 0 | 0 |
| 21.01.2018 18:00 - 19:00 | 0 | 0 | 0 | 0 |
| 21.01.2018 19:00 - 20:00 | 0 | 0 | 0 | 0 |
| 21.01.2018 20:00 - 21:00 | 0 | 0 | 0 | 0 |
| 21.01.2018 21:00 - 22:00 | 0 | 0 | 0 | 0 |
| 21.01.2018 22:00 - 23:00 | 650 | 0 | 0 | 0 |
| 21.01.2018 23:00 - 24:00 | 650 | 0 | 0 | 0 |
| 22.01.2018 00:00 - 01:00 | 1050 | 0 | 0 | 0 |
| 22.01.2018 01:00 - 02:00 | 1050 | 0 | 0 | 0 |
| 22.01.2018 02:00 - 03:00 | 1050 | 0 | 0 | 0 |
| 22.01.2018 03:00 - 04:00 | 1050 | 0 | 0 | 0 |
| 22.01.2018 04:00 - 05:00 | 1050 | 0 | 0 | 0 |
| 22.01.2018 05:00 - 06:00 | 1050 | 0 | 0 | 0 |
| 22.01.2018 06:00 - 07:00 | 0 | 0 | 0 | 0 |
| 22.01.2018 07:00 - 08:00 | 0 | 0 | 0 | 0 |
| 22.01.2018 08:00 - 09:00 | 0 | 0 | 0 | 0 |
| 22.01.2018 09:00 - 10:00 | 0 | 0 | 0 | 0 |
| 22.01.2018 10:00 - 11:00 | 0 | 0 | 0 | 0 |
| 22.01.2018 11:00 - 12:00 | 0 | 0 | 0 | 0 |
| 22.01.2018 12:00 - 13:00 | 0 | 0 | 0 | 0 |
| 22.01.2018 13:00 - 14:00 | 0 | 0 | 0 | 0 |
| 22.01.2018 14:00 - 15:00 | 0 | 0 | 0 | 0 |
| 22.01.2018 15:00 - 16:00 | 0 | 0 | 0 | 0 |
| 22.01.2018 16:00 - 17:00 | 0 | 0 | 0 | 0 |
| 22.01.2018 17:00 - 18:00 | 0 | 0 | 0 | 0 |
| 22.01.2018 18:00 - 19:00 | 0 | 0 | 0 | 0 |
| 22.01.2018 19:00 - 20:00 | 0 | 0 | 0 | 0 |
| 22.01.2018 20:00 - 21:00 | 0 | 0 | 0 | 0 |
| 22.01.2018 21:00 - 22:00 | 0 | 0 | 0 | 0 |
| 22.01.2018 22:00 - 23:00 | 0 | 0 | 0 | 0 |
| 22.01.2018 23:00 - 24:00 | 0 | 0 | 0 | 0 |
| 23.01.2018 00:00 - 01:00 | 600 | 0 | 0 | 0 |
| 23.01.2018 01:00 - 02:00 | 600 | 0 | 0 | 0 |
| 23.01.2018 02:00 - 03:00 | 600 | 0 | 0 | 0 |
| 23.01.2018 03:00 - 04:00 | 600 | 0 | 0 | 0 |
| 23.01.2018 04:00 - 05:00 | 600 | 0 | 0 | 0 |
| 23.01.2018 05:00 - 06:00 | 600 | 0 | 0 | 0 |
| 23.01.2018 06:00 - 07:00 | 0 | 0 | 0 | 0 |
| 23.01.2018 07:00 - 08:00 | 0 | 0 | 0 | 0 |
| 23.01.2018 08:00 - 09:00 | 0 | 0 | 0 | 0 |
| 23.01.2018 09:00 - 10:00 | 0 | 0 | 0 | 0 |
| 23.01.2018 10:00 - 11:00 | 0 | 0 | 0 | 0 |
| 23.01.2018 11:00 - 12:00 | 0 | 0 | 0 | 0 |
| 23.01.2018 12:00 - 13:00 | 0 | 0 | 0 | 0 |
| 23.01.2018 13:00 - 14:00 | 0 | 0 | 0 | 0 |
| 23.01.2018 14:00 - 15:00 | 0 | 0 | 0 | 0 |
| 23.01.2018 15:00 - 16:00 | 0 | 0 | 0 | 0 |
| 23.01.2018 16:00 - 17:00 | 0 | 0 | 0 | 0 |
| 23.01.2018 17:00 - 18:00 | 1 | 0 | 0 | 0 |
| 23.01.2018 18:00 - 19:00 | 1 | 0 | 0 | 0 |
| 23.01.2018 19:00 - 20:00 | 1 | 0 | 0 | 0 |
| 23.01.2018 20:00 - 21:00 | 1 | 0 | 0 | 0 |
| 23.01.2018 21:00 - 22:00 | 1 | 0 | 0 | 0 |
| 23.01.2018 22:00 - 23:00 | 1 | 0 | 0 | 0 |
| 23.01.2018 23:00 - 24:00 | 1 | 0 | 0 | 0 |
| 24.01.2018 00:00 - 01:00 | 1 | 0 | 0 | 0 |
| 24.01.2018 01:00 - 02:00 | 1 | 0 | 0 | 0 |
| 24.01.2018 02:00 - 03:00 | 1 | 0 | 0 | 0 |
| 24.01.2018 03:00 - 04:00 | 1 | 0 | 0 | 0 |
| 24.01.2018 04:00 - 05:00 | 1 | 0 | 0 | 0 |
| 24.01.2018 05:00 - 06:00 | 1 | 0 | 0 | 0 |
| 24.01.2018 06:00 - 07:00 | 0 | 0 | 0 | 0 |
| 24.01.2018 07:00 - 08:00 | 0 | 0 | 0 | 0 |
| 24.01.2018 08:00 - 09:00 | 0 | 0 | 0 | 0 |
| 24.01.2018 09:00 - 10:00 | 0 | 0 | 0 | 0 |
| 24.01.2018 10:00 - 11:00 | 0 | 0 | 0 | 0 |
| 24.01.2018 11:00 - 12:00 | 0 | 0 | 0 | 0 |
| 24.01.2018 12:00 - 13:00 | 0 | 0 | 0 | 0 |
| 24.01.2018 13:00 - 14:00 | 0 | 0 | 0 | 0 |
| 24.01.2018 14:00 - 15:00 | 0 | 0 | 0 | 0 |
| 24.01.2018 15:00 - 16:00 | 0 | 0 | 0 | 0 |
| 24.01.2018 16:00 - 17:00 | 0 | 0 | 0 | 0 |
| 24.01.2018 17:00 - 18:00 | 0 | 0 | 0 | 0 |
| 24.01.2018 18:00 - 19:00 | 0 | 0 | 0 | 0 |
| 24.01.2018 19:00 - 20:00 | 0 | 0 | 0 | 0 |
| 24.01.2018 20:00 - 21:00 | 0 | 0 | 0 | 0 |
| 24.01.2018 21:00 - 22:00 | 0 | 0 | 0 | 0 |
| 24.01.2018 22:00 - 23:00 | 0 | 0 | 0 | 0 |
| 24.01.2018 23:00 - 24:00 | 0 | 0 | 0 | 0 |
| 25.01.2018 00:00 - 01:00 | 0 | 0 | 0 | 0 |
| 25.01.2018 01:00 - 02:00 | 0 | 0 | 0 | 0 |
| 25.01.2018 02:00 - 03:00 | 0 | 0 | 0 | 0 |
| 25.01.2018 03:00 - 04:00 | 0 | 0 | 0 | 0 |
| 25.01.2018 04:00 - 05:00 | 0 | 0 | 0 | 0 |
| 25.01.2018 05:00 - 06:00 | 0 | 0 | 0 | 0 |
| 25.01.2018 06:00 - 07:00 | 0 | 0 | 0 | 0 |
| 25.01.2018 07:00 - 08:00 | 0 | 0 | 0 | 0 |
| 25.01.2018 08:00 - 09:00 | 0 | 0 | 0 | 0 |
| 25.01.2018 09:00 - 10:00 | 0 | 0 | 0 | 0 |
| 25.01.2018 10:00 - 11:00 | 0 | 0 | 0 | 0 |
| 25.01.2018 11:00 - 12:00 | 0 | 0 | 0 | 0 |
| 25.01.2018 12:00 - 13:00 | 0 | 0 | 0 | 0 |
| 25.01.2018 13:00 - 14:00 | 0 | 0 | 0 | 0 |
| 25.01.2018 14:00 - 15:00 | 0 | 0 | 0 | 0 |
| 25.01.2018 15:00 - 16:00 | 0 | 0 | 0 | 0 |
| 25.01.2018 16:00 - 17:00 | 0 | 0 | 0 | 0 |
| 25.01.2018 17:00 - 18:00 | 0 | 0 | 0 | 0 |
| 25.01.2018 18:00 - 19:00 | 0 | 0 | 0 | 0 |
| 25.01.2018 19:00 - 20:00 | 0 | 0 | 0 | 0 |
| 25.01.2018 20:00 - 21:00 | 0 | 0 | 0 | 0 |
| 25.01.2018 21:00 - 22:00 | 0 | 0 | 0 | 0 |
| 25.01.2018 22:00 - 23:00 | 0 | 0 | 0 | 0 |
| 25.01.2018 23:00 - 24:00 | 0 | 0 | 0 | 0 |
| 26.01.2018 00:00 - 01:00 | 0 | 0 | 0 | 0 |
| 26.01.2018 01:00 - 02:00 | 0 | 0 | 0 | 0 |
| 26.01.2018 02:00 - 03:00 | 0 | 0 | 0 | 0 |
| 26.01.2018 03:00 - 04:00 | 0 | 0 | 0 | 0 |
| 26.01.2018 04:00 - 05:00 | 0 | 0 | 0 | 0 |
| 26.01.2018 05:00 - 06:00 | 0 | 0 | 0 | 0 |
| 26.01.2018 06:00 - 07:00 | 0 | 0 | 0 | 0 |
| 26.01.2018 07:00 - 08:00 | 0 | 0 | 0 | 0 |
| 26.01.2018 08:00 - 09:00 | 0 | 0 | 0 | 0 |
| 26.01.2018 09:00 - 10:00 | 0 | 0 | 0 | 0 |
| 26.01.2018 10:00 - 11:00 | 0 | 0 | 0 | 0 |
| 26.01.2018 11:00 - 12:00 | 0 | 0 | 0 | 0 |
| 26.01.2018 12:00 - 13:00 | 0 | 0 | 0 | 0 |
| 26.01.2018 13:00 - 14:00 | 0 | 0 | 0 | 0 |
| 26.01.2018 14:00 - 15:00 | 0 | 0 | 0 | 0 |
| 26.01.2018 15:00 - 16:00 | 0 | 0 | 0 | 0 |
| 26.01.2018 16:00 - 17:00 | 0 | 0 | 0 | 0 |
| 26.01.2018 17:00 - 18:00 | 0 | 0 | 0 | 0 |
| 26.01.2018 18:00 - 19:00 | 0 | 0 | 0 | 0 |
| 26.01.2018 19:00 - 20:00 | 0 | 0 | 0 | 0 |
| 26.01.2018 20:00 - 21:00 | 0 | 0 | 0 | 0 |
| 26.01.2018 21:00 - 22:00 | 0 | 0 | 0 | 0 |
| 26.01.2018 22:00 - 23:00 | 0 | 0 | 0 | 0 |
| 26.01.2018 23:00 - 24:00 | 0 | 0 | 0 | 0 |
| 27.01.2018 00:00 - 01:00 | 0 | 0 | 0 | 0 |
| 27.01.2018 01:00 - 02:00 | 0 | 0 | 0 | 0 |
| 27.01.2018 02:00 - 03:00 | 0 | 0 | 0 | 0 |
| 27.01.2018 03:00 - 04:00 | 0 | 0 | 0 | 0 |
| 27.01.2018 04:00 - 05:00 | 550 | 0 | 0 | 0 |
| 27.01.2018 05:00 - 06:00 | 550 | 0 | 0 | 0 |
| 27.01.2018 06:00 - 07:00 | 0 | 0 | 0 | 0 |
| 27.01.2018 07:00 - 08:00 | 0 | 0 | 0 | 0 |
| 27.01.2018 08:00 - 09:00 | 0 | 0 | 0 | 0 |
| 27.01.2018 09:00 - 10:00 | 0 | 0 | 0 | 0 |
| 27.01.2018 10:00 - 11:00 | 0 | 0 | 0 | 0 |
| 27.01.2018 11:00 - 12:00 | 0 | 0 | 0 | 0 |
| 27.01.2018 12:00 - 13:00 | 0 | 0 | 0 | 0 |
| 27.01.2018 13:00 - 14:00 | 0 | 0 | 0 | 0 |
| 27.01.2018 14:00 - 15:00 | 0 | 0 | 0 | 0 |
| 27.01.2018 15:00 - 16:00 | 0 | 0 | 0 | 0 |
| 27.01.2018 16:00 - 17:00 | 0 | 0 | 0 | 0 |
| 27.01.2018 17:00 - 18:00 | 0 | 0 | 0 | 0 |
| 27.01.2018 18:00 - 19:00 | 0 | 0 | 0 | 0 |
| 27.01.2018 19:00 - 20:00 | 250 | 0 | 0 | 0 |
| 27.01.2018 20:00 - 21:00 | 400 | 0 | 0 | 0 |
| 27.01.2018 21:00 - 22:00 | 400 | 0 | 0 | 0 |
| 27.01.2018 22:00 - 23:00 | 400 | 0 | 0 | 0 |
| 27.01.2018 23:00 - 24:00 | 400 | 0 | 0 | 0 |
| 28.01.2018 00:00 - 01:00 | 400 | 0 | 0 | 0 |
| 28.01.2018 01:00 - 02:00 | 400 | 0 | 0 | 0 |
| 28.01.2018 02:00 - 03:00 | 400 | 0 | 0 | 0 |
| 28.01.2018 03:00 - 04:00 | 400 | 0 | 0 | 0 |
| 28.01.2018 04:00 - 05:00 | 400 | 0 | 0 | 0 |
| 28.01.2018 05:00 - 06:00 | 400 | 0 | 0 | 0 |
| 28.01.2018 06:00 - 07:00 | 0 | 0 | 0 | 0 |
| 28.01.2018 07:00 - 08:00 | 0 | 0 | 0 | 0 |
| 28.01.2018 08:00 - 09:00 | 0 | 0 | 0 | 0 |
| 28.01.2018 09:00 - 10:00 | 0 | 0 | 0 | 0 |
| 28.01.2018 10:00 - 11:00 | 0 | 0 | 0 | 0 |
| 28.01.2018 11:00 - 12:00 | 0 | 0 | 0 | 0 |
| 28.01.2018 12:00 - 13:00 | 0 | 0 | 0 | 0 |
| 28.01.2018 13:00 - 14:00 | 0 | 0 | 0 | 0 |
| 28.01.2018 14:00 - 15:00 | 0 | 0 | 0 | 0 |
| 28.01.2018 15:00 - 16:00 | 0 | 0 | 0 | 0 |
| 28.01.2018 16:00 - 17:00 | 0 | 0 | 0 | 0 |
| 28.01.2018 17:00 - 18:00 | 0 | 0 | 0 | 0 |
| 28.01.2018 18:00 - 19:00 | 0 | 0 | 0 | 0 |
| 28.01.2018 19:00 - 20:00 | 0 | 0 | 0 | 0 |
| 28.01.2018 20:00 - 21:00 | 0 | 0 | 0 | 0 |
| 28.01.2018 21:00 - 22:00 | 0 | 0 | 0 | 0 |
| 28.01.2018 22:00 - 23:00 | 0 | 0 | 0 | 0 |
| 28.01.2018 23:00 - 24:00 | 0 | 0 | 0 | 0 |
| 29.01.2018 00:00 - 01:00 | 0 | 0 | 0 | 0 |
| 29.01.2018 01:00 - 02:00 | 0 | 0 | 0 | 0 |
| 29.01.2018 02:00 - 03:00 | 0 | 0 | 0 | 0 |
| 29.01.2018 03:00 - 04:00 | 0 | 0 | 0 | 0 |
| 29.01.2018 04:00 - 05:00 | 0 | 0 | 0 | 0 |
| 29.01.2018 05:00 - 06:00 | 0 | 0 | 0 | 0 |
| 29.01.2018 06:00 - 07:00 | 0 | 0 | 0 | 0 |
| 29.01.2018 07:00 - 08:00 | 0 | 0 | 0 | 0 |
| 29.01.2018 08:00 - 09:00 | 0 | 0 | 0 | 0 |
| 29.01.2018 09:00 - 10:00 | 0 | 0 | 0 | 0 |
| 29.01.2018 10:00 - 11:00 | 0 | 0 | 0 | 0 |
| 29.01.2018 11:00 - 12:00 | 0 | 0 | 0 | 0 |
| 29.01.2018 12:00 - 13:00 | 0 | 0 | 0 | 0 |
| 29.01.2018 13:00 - 14:00 | 0 | 0 | 0 | 0 |
| 29.01.2018 14:00 - 15:00 | 0 | 0 | 0 | 0 |
| 29.01.2018 15:00 - 16:00 | 0 | 0 | 0 | 0 |
| 29.01.2018 16:00 - 17:00 | 0 | 0 | 0 | 0 |
| 29.01.2018 17:00 - 18:00 | 0 | 0 | 0 | 0 |
| 29.01.2018 18:00 - 19:00 | 0 | 0 | 0 | 0 |
| 29.01.2018 19:00 - 20:00 | 0 | 0 | 0 | 0 |
| 29.01.2018 20:00 - 21:00 | 0 | 0 | 0 | 0 |
| 29.01.2018 21:00 - 22:00 | 0 | 0 | 0 | 0 |
| 29.01.2018 22:00 - 23:00 | 0 | 0 | 0 | 0 |
| 29.01.2018 23:00 - 24:00 | 0 | 0 | 0 | 0 |
| 30.01.2018 00:00 - 01:00 | 0 | 0 | 0 | 0 |
| 30.01.2018 01:00 - 02:00 | 0 | 0 | 0 | 0 |
| 30.01.2018 02:00 - 03:00 | 0 | 0 | 0 | 0 |
| 30.01.2018 03:00 - 04:00 | 0 | 0 | 0 | 0 |
| 30.01.2018 04:00 - 05:00 | 0 | 0 | 0 | 0 |
| 30.01.2018 05:00 - 06:00 | 0 | 0 | 0 | 0 |
| 30.01.2018 06:00 - 07:00 | 0 | 0 | 0 | 0 |
| 30.01.2018 07:00 - 08:00 | 0 | 0 | 0 | 0 |
| 30.01.2018 08:00 - 09:00 | 0 | 0 | 0 | 0 |
| 30.01.2018 09:00 - 10:00 | 0 | 0 | 0 | 0 |
| 30.01.2018 10:00 - 11:00 | 0 | 0 | 0 | 0 |
| 30.01.2018 11:00 - 12:00 | 0 | 0 | 0 | 0 |
| 30.01.2018 12:00 - 13:00 | 0 | 0 | 0 | 0 |
| 30.01.2018 13:00 - 14:00 | 0 | 0 | 0 | 0 |
| 30.01.2018 14:00 - 15:00 | 0 | 0 | 0 | 0 |
| 30.01.2018 15:00 - 16:00 | 0 | 0 | 0 | 0 |
| 30.01.2018 16:00 - 17:00 | 0 | 0 | 0 | 0 |
| 30.01.2018 17:00 - 18:00 | 0 | 0 | 0 | 0 |
| 30.01.2018 18:00 - 19:00 | 0 | 0 | 0 | 0 |
| 30.01.2018 19:00 - 20:00 | 0 | 0 | 0 | 0 |
| 30.01.2018 20:00 - 21:00 | 0 | 0 | 0 | 0 |
| 30.01.2018 21:00 - 22:00 | 0 | 0 | 0 | 0 |
| 30.01.2018 22:00 - 23:00 | 0 | 0 | 0 | 0 |
| 30.01.2018 23:00 - 24:00 | 0 | 0 | 0 | 0 |
| 31.01.2018 00:00 - 01:00 | 300 | 0 | 0 | 0 |
| 31.01.2018 01:00 - 02:00 | 300 | 0 | 0 | 0 |
| 31.01.2018 02:00 - 03:00 | 300 | 0 | 0 | 0 |
| 31.01.2018 03:00 - 04:00 | 300 | 0 | 0 | 0 |
| 31.01.2018 04:00 - 05:00 | 300 | 0 | 0 | 0 |
| 31.01.2018 05:00 - 06:00 | 300 | 0 | 0 | 0 |
| 31.01.2018 06:00 - 07:00 | 0 | 0 | 0 | 0 |
| 31.01.2018 07:00 - 08:00 | 0 | 0 | 0 | 0 |
| 31.01.2018 08:00 - 09:00 | 0 | 0 | 0 | 0 |
| 31.01.2018 09:00 - 10:00 | 0 | 0 | 0 | 0 |
| 31.01.2018 10:00 - 11:00 | 0 | 0 | 0 | 0 |
| 31.01.2018 11:00 - 12:00 | 0 | 0 | 0 | 0 |
| 31.01.2018 12:00 - 13:00 | 400 | 0 | 0 | 0 |
| 31.01.2018 13:00 - 14:00 | 400 | 0 | 0 | 0 |
| 31.01.2018 14:00 - 15:00 | 400 | 0 | 0 | 0 |
| 31.01.2018 15:00 - 16:00 | 400 | 0 | 0 | 0 |
| 31.01.2018 16:00 - 17:00 | 400 | 0 | 0 | 0 |
| 31.01.2018 17:00 - 18:00 | 400 | 0 | 0 | 0 |
| 31.01.2018 18:00 - 19:00 | 800 | 0 | 0 | 0 |
| 31.01.2018 19:00 - 20:00 | 800 | 0 | 0 | 0 |
| 31.01.2018 20:00 - 21:00 | 800 | 0 | 0 | 0 |
| 31.01.2018 21:00 - 22:00 | 800 | 0 | 0 | 0 |
| 31.01.2018 22:00 - 23:00 | 1200 | 0 | 0 | 0 |
| 31.01.2018 23:00 - 24:00 | 1200 | 0 | 0 | 0 |
| 01.02.2018 00:00 - 01:00 | 1800 | 0 | 0 | 0 |
| 01.02.2018 01:00 - 02:00 | 1800 | 0 | 0 | 0 |
| 01.02.2018 02:00 - 03:00 | 1800 | 0 | 0 | 0 |
| 01.02.2018 03:00 - 04:00 | 2200 | 0 | 0 | 0 |
| 01.02.2018 04:00 - 05:00 | 2200 | 0 | 0 | 0 |
| 01.02.2018 05:00 - 06:00 | 2200 | 0 | 0 | 0 |